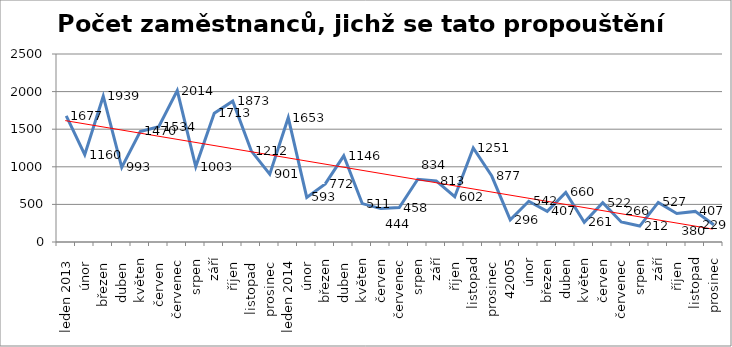
| Category | Series 0 |
|---|---|
|  leden 2013 | 1677 |
| únor  | 1160 |
| březen  | 1939 |
| duben  | 993 |
| květen | 1470 |
| červen  | 1534 |
| červenec | 2014 |
| srpen | 1003 |
| září | 1713 |
| říjen  | 1873 |
| listopad  | 1212 |
| prosinec  | 901 |
|  leden 2014 | 1653 |
| únor  | 593 |
| březen | 772 |
| duben  | 1146 |
| květen | 511 |
| červen | 444 |
| červenec | 458 |
| srpen | 834 |
| září | 813 |
| říjen  | 602 |
| listopad | 1251 |
| prosinec  | 877 |
| 42005 | 296 |
| únor | 542 |
| březen | 407 |
| duben | 660 |
| květen | 261 |
| červen | 522 |
| červenec | 266 |
| srpen | 212 |
| září | 527 |
| říjen  | 380 |
| listopad | 407 |
| prosinec | 229 |